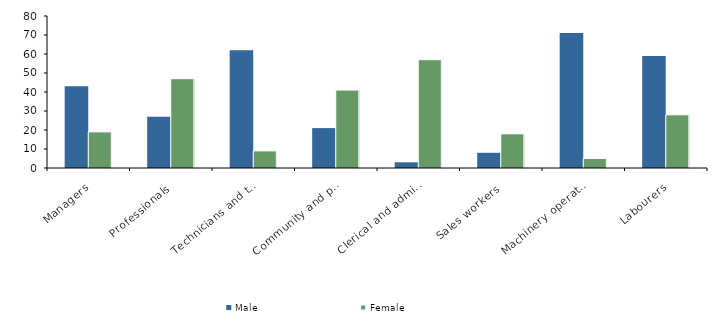
| Category | Male | Female |
|---|---|---|
| Managers | 43 | 19 |
| Professionals | 27 | 47 |
| Technicians and trades workers | 62 | 9 |
| Community and personal service workers | 21 | 41 |
| Clerical and administrative workers | 3 | 57 |
| Sales workers | 8 | 18 |
| Machinery operators and drivers | 71 | 5 |
| Labourers | 59 | 28 |